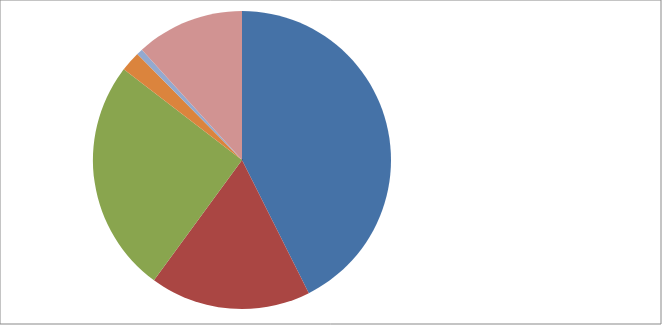
| Category | 2012 | 2013 |
|---|---|---|
| IMU - ICI | 951103 | 844258.81 |
| ADDIZ IRPEF | 390000 | 449985.65 |
| FONDO SPERIMENTALE RIEQUIL. | 565897 | 0 |
| COMPARTECIP IVA | 0 | 0 |
| FONDO SOLIDARIETA' COMUNALE | 0 | 737570 |
| TRASFERIMENTI DALLO STATO | 48910.1 | 391701.37 |
| TRASFERIM. REGIONE | 14983.98 | 19390.12 |
| PROVENTI DA SERV BENI E DIVERSI | 261913.47 | 346293.49 |